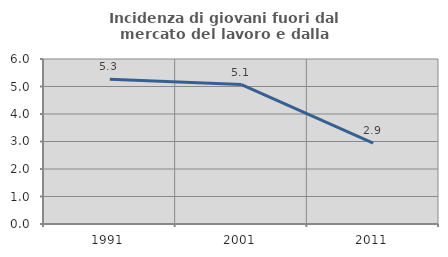
| Category | Incidenza di giovani fuori dal mercato del lavoro e dalla formazione  |
|---|---|
| 1991.0 | 5.263 |
| 2001.0 | 5.069 |
| 2011.0 | 2.941 |